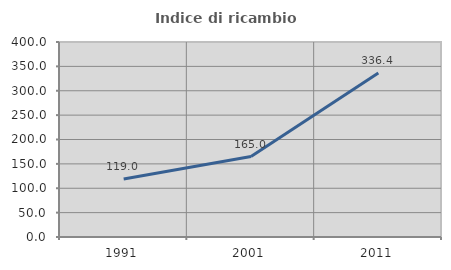
| Category | Indice di ricambio occupazionale  |
|---|---|
| 1991.0 | 118.984 |
| 2001.0 | 164.97 |
| 2011.0 | 336.402 |